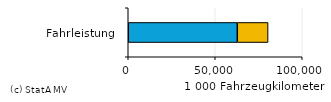
| Category | Öffentliche Unternehmen | Private und gemischtwirtschaftliche Unternehmen |
|---|---|---|
| 0 | 62667 | 17691 |